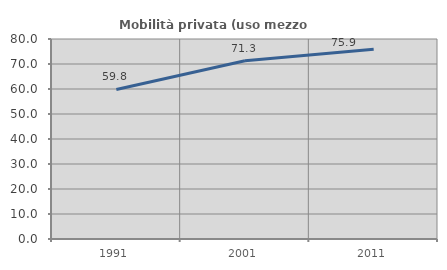
| Category | Mobilità privata (uso mezzo privato) |
|---|---|
| 1991.0 | 59.817 |
| 2001.0 | 71.311 |
| 2011.0 | 75.93 |